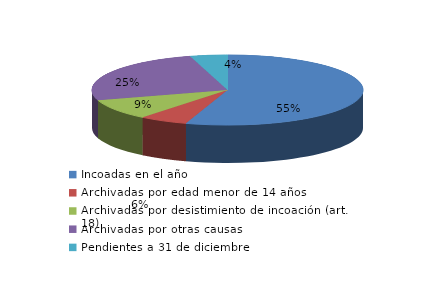
| Category | Series 0 |
|---|---|
| Incoadas en el año | 9801 |
| Archivadas por edad menor de 14 años | 1032 |
| Archivadas por desistimiento de incoación (art. 18) | 1694 |
| Archivadas por otras causas | 4515 |
| Pendientes a 31 de diciembre | 792 |